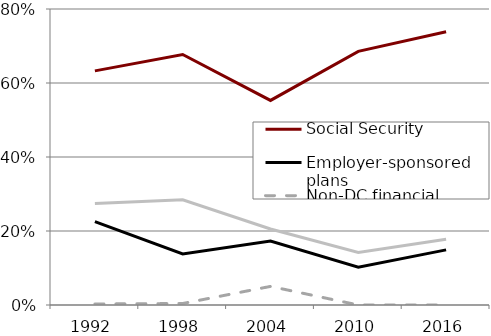
| Category | Social Security | Employer-sponsored plans | Non-DC financial | Housing |
|---|---|---|---|---|
| 1992.0 | 0.633 | 0.225 | 0.003 | 0.274 |
| 1998.0 | 0.677 | 0.138 | 0.004 | 0.284 |
| 2004.0 | 0.553 | 0.173 | 0.05 | 0.205 |
| 2010.0 | 0.686 | 0.102 | 0 | 0.142 |
| 2016.0 | 0.739 | 0.149 | 0 | 0.178 |